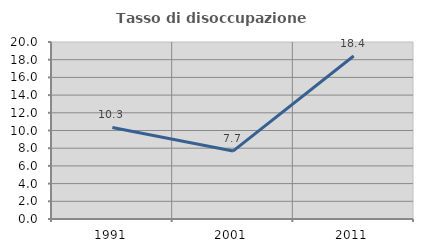
| Category | Tasso di disoccupazione giovanile  |
|---|---|
| 1991.0 | 10.345 |
| 2001.0 | 7.673 |
| 2011.0 | 18.413 |